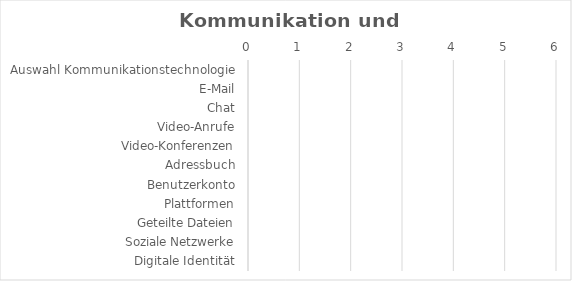
| Category | Kommunikation und Zusammenarbeit |
|---|---|
| Auswahl Kommunikationstechnologie | 0 |
| E-Mail | 0 |
| Chat | 0 |
| Video-Anrufe | 0 |
| Video-Konferenzen | 0 |
| Adressbuch | 0 |
| Benutzerkonto | 0 |
| Plattformen | 0 |
| Geteilte Dateien | 0 |
| Soziale Netzwerke | 0 |
| Digitale Identität | 0 |